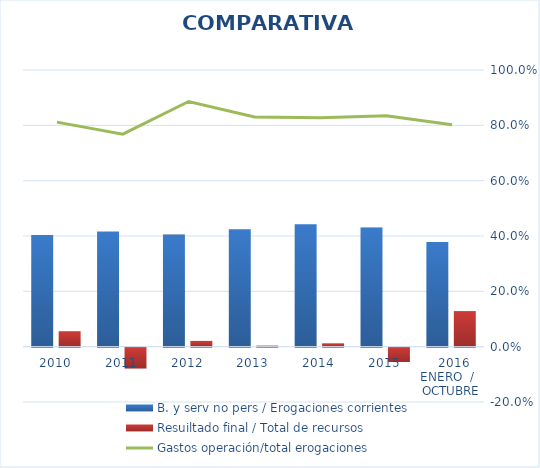
| Category | B. y serv no pers / Erogaciones corrientes | Resuiltado final / Total de recursos |
|---|---|---|
| 2010 | 0.403 | 0.056 |
| 2011 | 0.416 | -0.075 |
| 2012 | 0.405 | 0.021 |
| 2013 | 0.424 | 0.004 |
| 2014 | 0.442 | 0.012 |
| 2015 | 0.431 | -0.052 |
|  2016 ENERO  /   OCTUBRE | 0.379 | 0.129 |